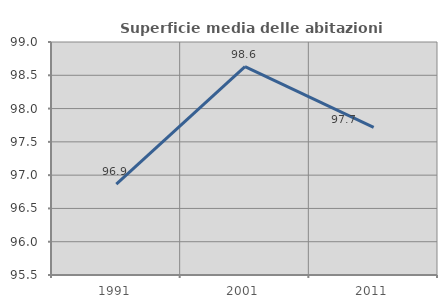
| Category | Superficie media delle abitazioni occupate |
|---|---|
| 1991.0 | 96.866 |
| 2001.0 | 98.63 |
| 2011.0 | 97.719 |